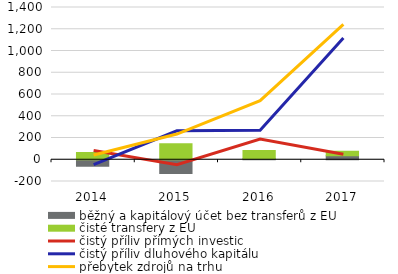
| Category | běžný a kapitálový účet bez transferů z EU | čisté transfery z EU |
|---|---|---|
| 2014.0 | -60.1 | 67.8 |
| 2015.0 | -126.4 | 147.1 |
| 2016.0 | 8.5 | 76.7 |
| 2017.0 | 37.9 | 41.2 |